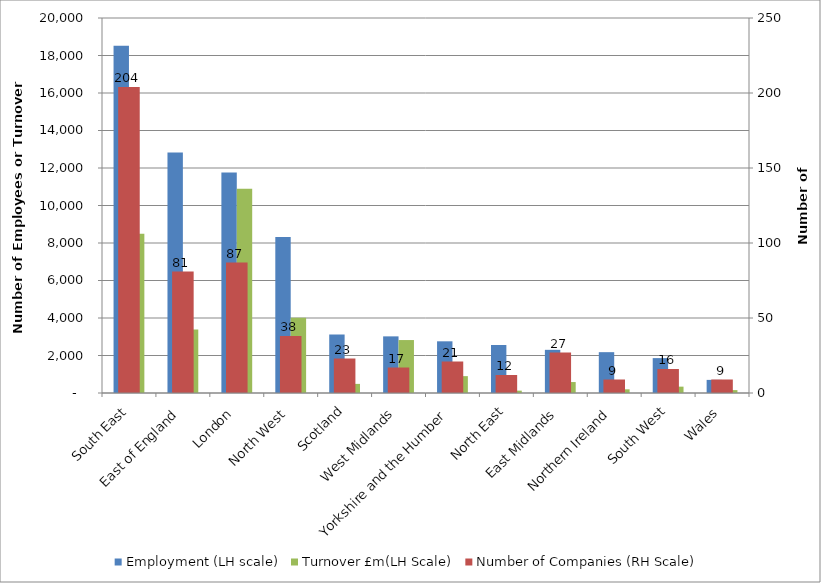
| Category | Employment (LH scale) | Turnover £m(LH Scale) |
|---|---|---|
| South East | 18515.85 | 8487.698 |
| East of England | 12833 | 3380.658 |
| London | 11766.2 | 10891.597 |
| North West | 8314.15 | 4008.371 |
| Scotland | 3120.3 | 485.931 |
| West Midlands | 3020.6 | 2824.32 |
| Yorkshire and the Humber | 2757 | 899.27 |
| North East | 2558.85 | 125.135 |
| East Midlands | 2302.25 | 584.612 |
| Northern Ireland | 2178 | 195.968 |
| South West | 1860.8 | 338.893 |
| Wales | 699 | 154.135 |